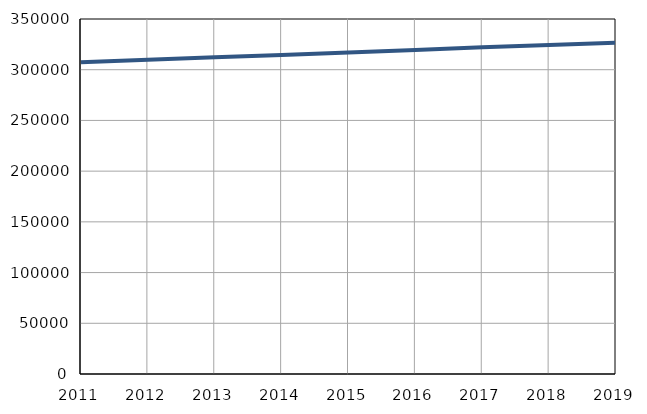
| Category | Број
становника |
|---|---|
| 2011.0 | 307426 |
| 2012.0 | 309762 |
| 2013.0 | 312247 |
| 2014.0 | 314620 |
| 2015.0 | 316942 |
| 2016.0 | 319484 |
| 2017.0 | 322071 |
| 2018.0 | 324422 |
| 2019.0 | 326644 |